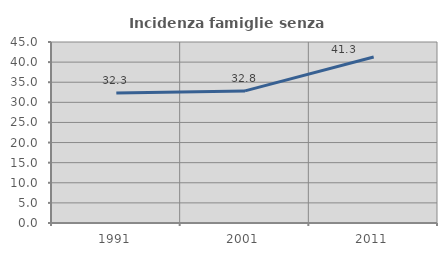
| Category | Incidenza famiglie senza nuclei |
|---|---|
| 1991.0 | 32.348 |
| 2001.0 | 32.839 |
| 2011.0 | 41.278 |